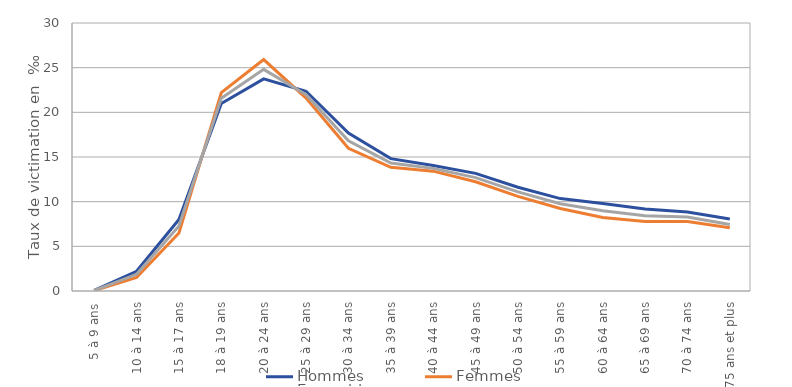
| Category | Hommes | Femmes | Ensemble |
|---|---|---|---|
| 5 à 9 ans | 0.066 | 0.044 | 0.055 |
| 10 à 14 ans | 2.207 | 1.518 | 1.871 |
| 15 à 17 ans | 8.001 | 6.501 | 7.271 |
| 18 à 19 ans | 20.999 | 22.211 | 21.587 |
| 20 à 24 ans | 23.742 | 25.905 | 24.808 |
| 25 à 29 ans | 22.364 | 21.599 | 21.978 |
| 30 à 34 ans | 17.692 | 15.974 | 16.81 |
| 35 à 39 ans | 14.819 | 13.846 | 14.321 |
| 40 à 44 ans | 14.046 | 13.417 | 13.727 |
| 45 à 49 ans | 13.171 | 12.228 | 12.695 |
| 50 à 54 ans | 11.613 | 10.586 | 11.092 |
| 55 à 59 ans | 10.344 | 9.228 | 9.771 |
| 60 à 64 ans | 9.797 | 8.239 | 8.982 |
| 65 à 69 ans | 9.173 | 7.773 | 8.432 |
| 70 à 74 ans | 8.851 | 7.788 | 8.28 |
| 75 ans et plus | 8.054 | 7.071 | 7.454 |